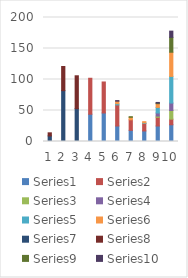
| Category | Series 0 | Series 1 | Series 2 | Series 3 | Series 4 | Series 5 | Series 6 | Series 7 | Series 8 | Series 9 |
|---|---|---|---|---|---|---|---|---|---|---|
| 0 | 0 | 0 | 0 | 0 | 0 | 0 | 9 | 5 | 0 | 0 |
| 1 | 0 | 0 | 0 | 0 | 0 | 0 | 82 | 39 | 0 | 0 |
| 2 | 0 | 0 | 0 | 0 | 0 | 0 | 53 | 53 | 0 | 0 |
| 3 | 44 | 58 | 0 | 0 | 0 | 0 | 0 | 0 | 0 | 0 |
| 4 | 46 | 50 | 0 | 0 | 0 | 0 | 0 | 0 | 0 | 0 |
| 5 | 25 | 34 | 0 | 0 | 2 | 4 | 0 | 0 | 0 | 1 |
| 6 | 18 | 17 | 0 | 0 | 0 | 4 | 0 | 0 | 1 | 0 |
| 7 | 17 | 12 | 0 | 0 | 1 | 2 | 0 | 0 | 0 | 0 |
| 8 | 25 | 14 | 2 | 5 | 9 | 6 | 0 | 0 | 1 | 1 |
| 9 | 27 | 9 | 14 | 12 | 43 | 39 | 0 | 0 | 24 | 10 |